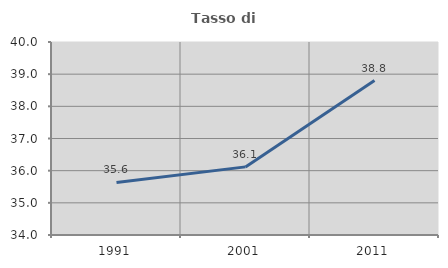
| Category | Tasso di occupazione   |
|---|---|
| 1991.0 | 35.634 |
| 2001.0 | 36.118 |
| 2011.0 | 38.802 |